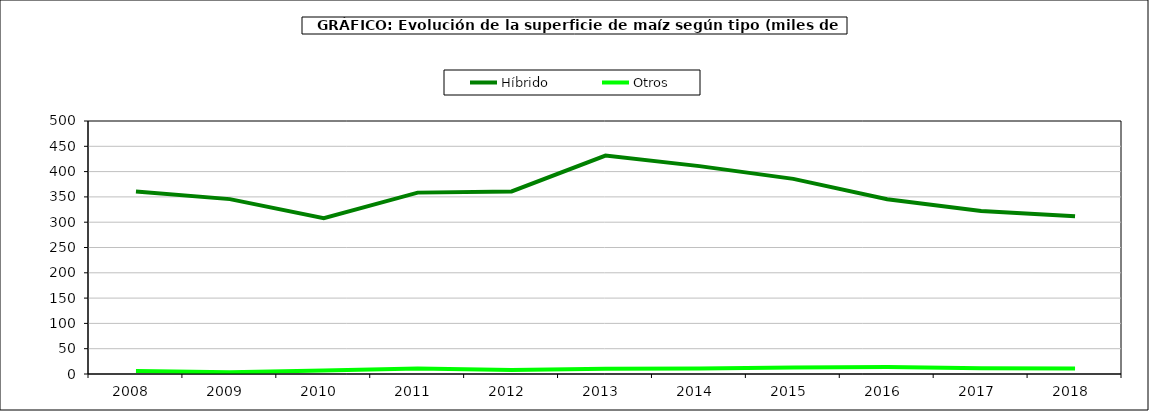
| Category | Híbrido | Otros |
|---|---|---|
| 2008.0 | 360.764 | 5.72 |
| 2009.0 | 345.605 | 3.344 |
| 2010.0 | 307.927 | 7.063 |
| 2011.0 | 358.45 | 10.814 |
| 2012.0 | 360.837 | 7.917 |
| 2013.0 | 431.742 | 10.556 |
| 2014.0 | 410.83 | 10.775 |
| 2015.0 | 385.617 | 12.64 |
| 2016.0 | 345.266 | 14.009 |
| 2017.0 | 322.341 | 11.287 |
| 2018.0 | 311.54 | 10.833 |